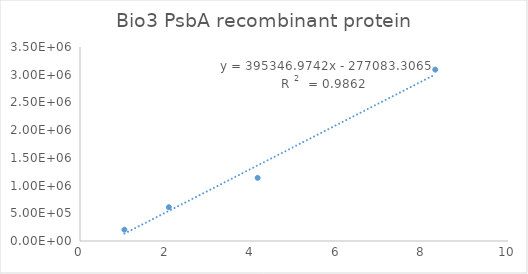
| Category | Series 0 |
|---|---|
| 8.3 | 3091093.78 |
| 4.15 | 1138945.83 |
| 2.075 | 609663.68 |
| 1.0375 | 204550.77 |